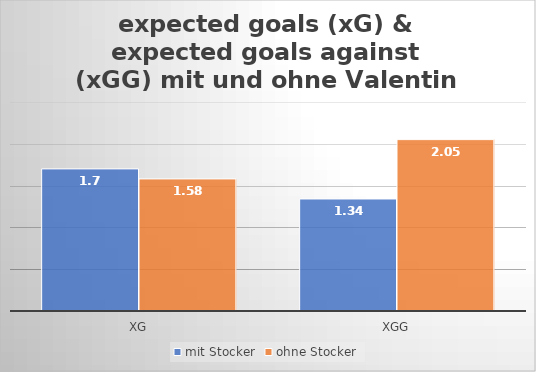
| Category | mit Stocker | ohne Stocker |
|---|---|---|
| xG | 1.7 | 1.58 |
| xGG | 1.34 | 2.05 |